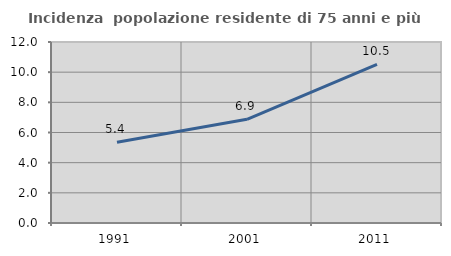
| Category | Incidenza  popolazione residente di 75 anni e più |
|---|---|
| 1991.0 | 5.354 |
| 2001.0 | 6.873 |
| 2011.0 | 10.515 |